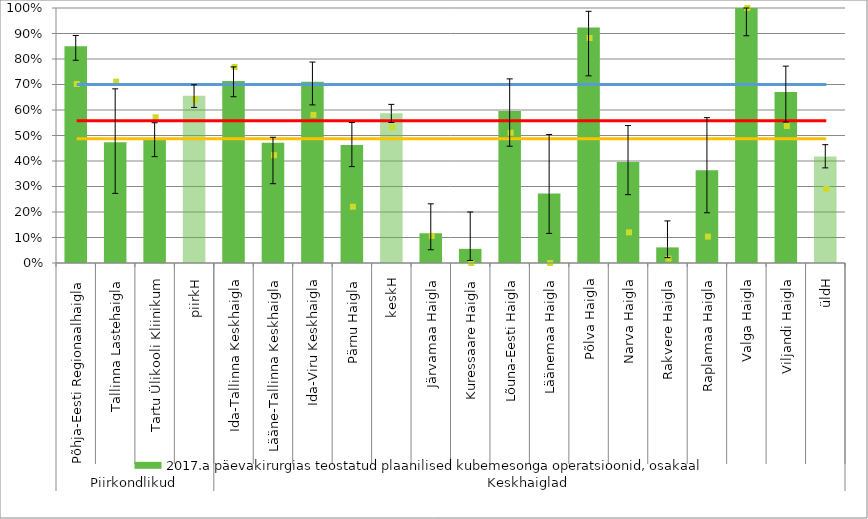
| Category | 2017.a päevakirurgias teostatud plaanilised kubemesonga operatsioonid, osakaal |
|---|---|
| 0 | 0.85 |
| 1 | 0.474 |
| 2 | 0.484 |
| 3 | 0.656 |
| 4 | 0.714 |
| 5 | 0.472 |
| 6 | 0.711 |
| 7 | 0.463 |
| 8 | 0.587 |
| 9 | 0.117 |
| 10 | 0.056 |
| 11 | 0.596 |
| 12 | 0.273 |
| 13 | 0.923 |
| 14 | 0.396 |
| 15 | 0.061 |
| 16 | 0.364 |
| 17 | 1 |
| 18 | 0.671 |
| 19 | 0.418 |